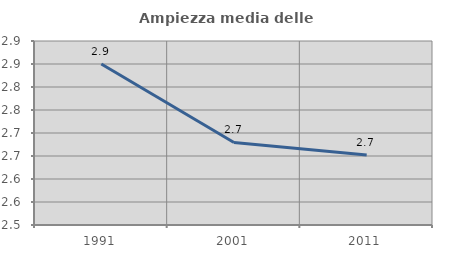
| Category | Ampiezza media delle famiglie |
|---|---|
| 1991.0 | 2.85 |
| 2001.0 | 2.679 |
| 2011.0 | 2.652 |